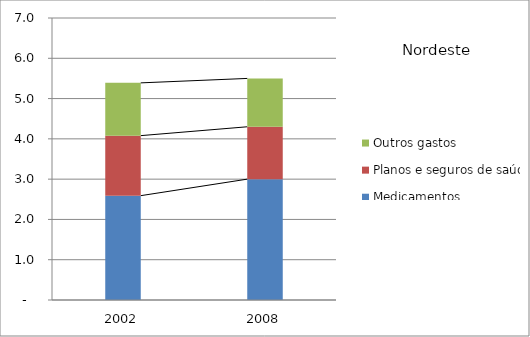
| Category | Medicamentos | Planos e seguros de saúde | Outros gastos |
|---|---|---|---|
| 2002.0 | 2.59 | 1.49 | 1.31 |
| 2008.0 | 3 | 1.3 | 1.2 |